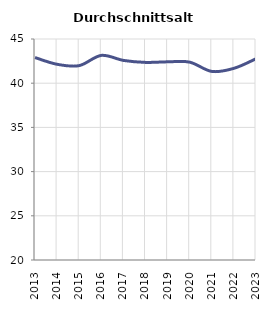
| Category | Durchschnittsalter |
|---|---|
| 2013.0 | 42.9 |
| 2014.0 | 42.138 |
| 2015.0 | 41.988 |
| 2016.0 | 43.145 |
| 2017.0 | 42.578 |
| 2018.0 | 42.353 |
| 2019.0 | 42.417 |
| 2020.0 | 42.38 |
| 2021.0 | 41.333 |
| 2022.0 | 41.68 |
| 2023.0 | 42.763 |